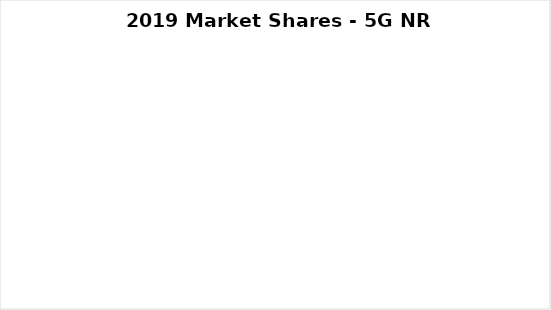
| Category | Series 0 |
|---|---|
| Ericsson | 0 |
| Fujitsu | 0 |
| Huawei | 0 |
| Mavenir | 0 |
| NEC | 0 |
| Nokia | 0 |
| Samsung | 0 |
| ZTE | 0 |
| Other | 0 |